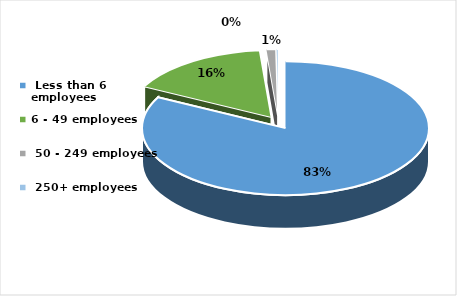
| Category | Series 0 |
|---|---|
|  Less than 6 employees | 0.826 |
| 6 - 49 employees | 0.161 |
|  50 - 249 employees | 0.011 |
|  250+ employees | 0.002 |